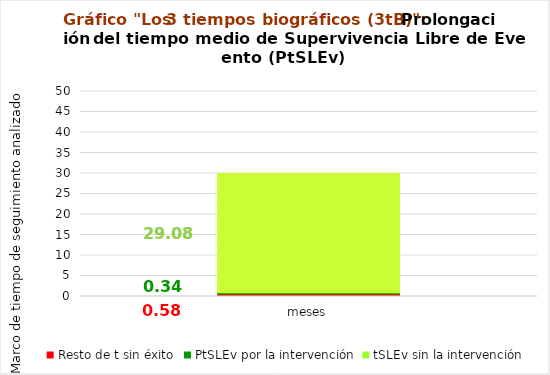
| Category | Resto de t sin éxito | PtSLEv por la intervención | tSLEv sin la intervención |
|---|---|---|---|
| meses | 0.581 | 0.341 | 29.079 |